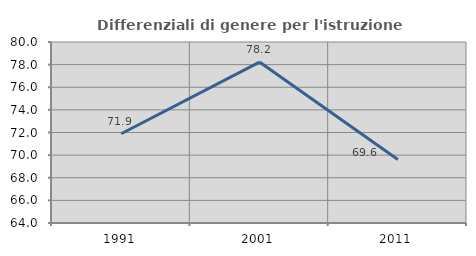
| Category | Differenziali di genere per l'istruzione superiore |
|---|---|
| 1991.0 | 71.888 |
| 2001.0 | 78.226 |
| 2011.0 | 69.611 |